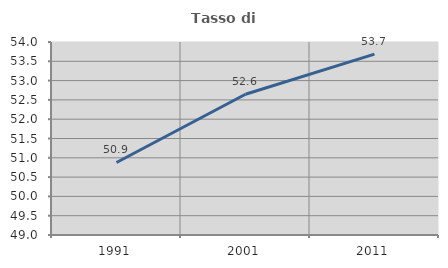
| Category | Tasso di occupazione   |
|---|---|
| 1991.0 | 50.878 |
| 2001.0 | 52.646 |
| 2011.0 | 53.686 |